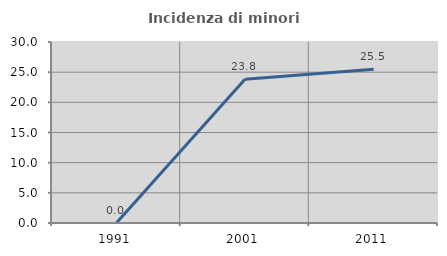
| Category | Incidenza di minori stranieri |
|---|---|
| 1991.0 | 0 |
| 2001.0 | 23.81 |
| 2011.0 | 25.49 |